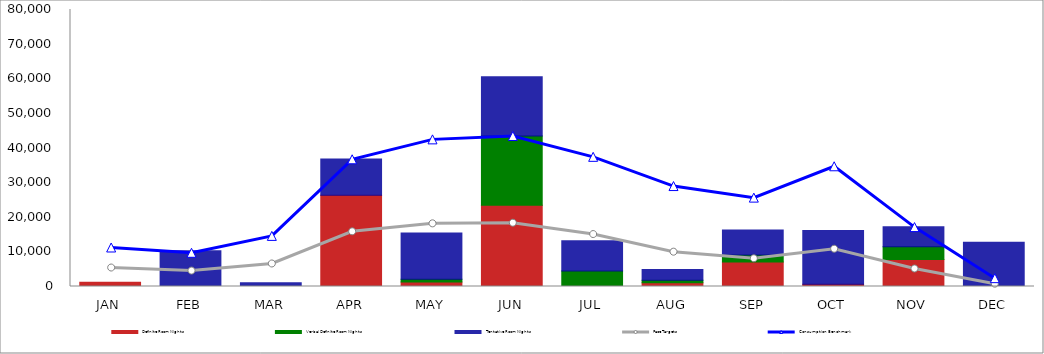
| Category | Definite Room Nights | Verbal Definite Room Nights | Tentative Room Nights |
|---|---|---|---|
| JAN | 1220 | 0 | 0 |
| FEB | 0 | 0 | 10360 |
| MAR | 0 | 0 | 1105 |
| APR | 26356 | 0 | 10433 |
| MAY | 1308 | 810 | 13337 |
| JUN | 23459 | 19975 | 17152 |
| JUL | 0 | 4474 | 8765 |
| AUG | 1056 | 750 | 3070 |
| SEP | 7055 | 2020 | 7262 |
| OCT | 619 | 0 | 15537 |
| NOV | 7826 | 3670 | 5740 |
| DEC | 0 | 0 | 12780 |